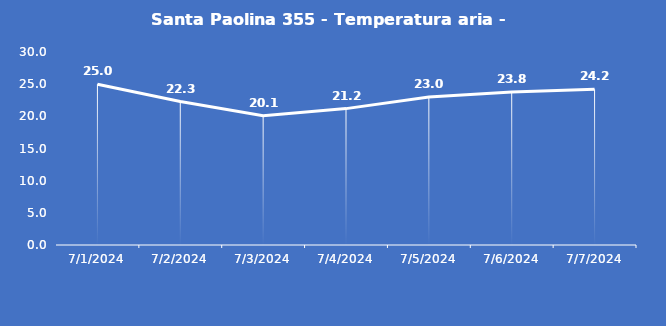
| Category | Santa Paolina 355 - Temperatura aria - Grezzo (°C) |
|---|---|
| 7/1/24 | 25 |
| 7/2/24 | 22.3 |
| 7/3/24 | 20.1 |
| 7/4/24 | 21.2 |
| 7/5/24 | 23 |
| 7/6/24 | 23.8 |
| 7/7/24 | 24.2 |